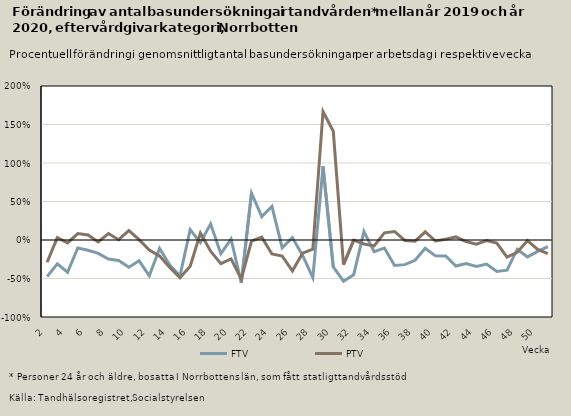
| Category | FTV | PTV |
|---|---|---|
| 2.0 | -0.476 | -0.289 |
| 3.0 | -0.311 | 0.03 |
| 4.0 | -0.418 | -0.037 |
| 5.0 | -0.104 | 0.084 |
| 6.0 | -0.134 | 0.065 |
| 7.0 | -0.173 | -0.025 |
| 8.0 | -0.248 | 0.084 |
| 9.0 | -0.266 | 0.004 |
| 10.0 | -0.353 | 0.122 |
| 11.0 | -0.27 | 0.004 |
| 12.0 | -0.465 | -0.131 |
| 13.0 | -0.109 | -0.206 |
| 14.0 | -0.327 | -0.356 |
| 15.0 | -0.464 | -0.491 |
| 16.0 | 0.134 | -0.339 |
| 17.0 | -0.034 | 0.091 |
| 18.0 | 0.21 | -0.146 |
| 19.0 | -0.178 | -0.307 |
| 20.0 | 0.012 | -0.246 |
| 21.0 | -0.558 | -0.507 |
| 22.0 | 0.609 | -0.015 |
| 23.0 | 0.305 | 0.037 |
| 24.0 | 0.435 | -0.181 |
| 25.0 | -0.1 | -0.208 |
| 26.0 | 0.031 | -0.4 |
| 27.0 | -0.201 | -0.171 |
| 28.0 | -0.488 | -0.119 |
| 29.0 | 0.957 | 1.667 |
| 30.0 | -0.35 | 1.412 |
| 31.0 | -0.535 | -0.32 |
| 32.0 | -0.451 | -0.002 |
| 33.0 | 0.11 | -0.052 |
| 34.0 | -0.151 | -0.076 |
| 35.0 | -0.104 | 0.093 |
| 36.0 | -0.33 | 0.111 |
| 37.0 | -0.32 | -0.006 |
| 38.0 | -0.264 | -0.015 |
| 39.0 | -0.106 | 0.106 |
| 40.0 | -0.206 | -0.013 |
| 41.0 | -0.208 | 0.009 |
| 42.0 | -0.338 | 0.04 |
| 43.0 | -0.306 | -0.02 |
| 44.0 | -0.344 | -0.054 |
| 45.0 | -0.313 | -0.008 |
| 46.0 | -0.408 | -0.04 |
| 47.0 | -0.391 | -0.221 |
| 48.0 | -0.12 | -0.16 |
| 49.0 | -0.219 | -0.009 |
| 50.0 | -0.148 | -0.123 |
| 51.0 | -0.087 | -0.177 |